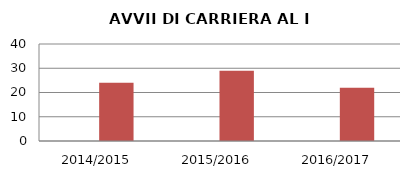
| Category | ANNO | NUMERO |
|---|---|---|
| 2014/2015 | 0 | 24 |
| 2015/2016 | 0 | 29 |
| 2016/2017 | 0 | 22 |